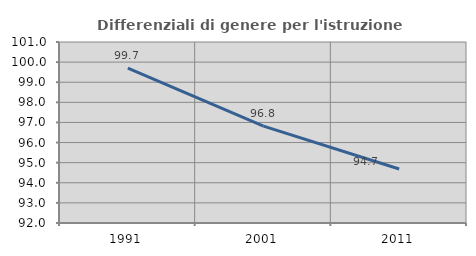
| Category | Differenziali di genere per l'istruzione superiore |
|---|---|
| 1991.0 | 99.703 |
| 2001.0 | 96.82 |
| 2011.0 | 94.686 |